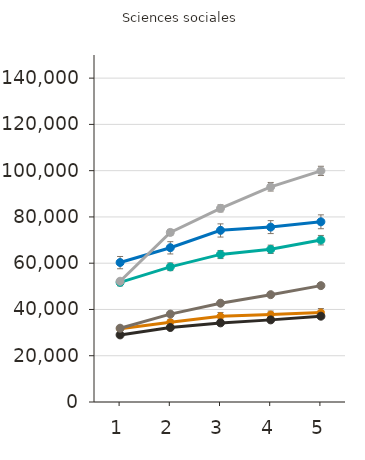
| Category | Certificat d'études collégial | Diplôme d'études collégial | Baccalauréat | Maîtrise | Doctorat | Grade professionnel |
|---|---|---|---|---|---|---|
| 1.0 | 31700 | 29000 | 31900 | 51700 | 60300 | 52200 |
| 2.0 | 34500 | 32200 | 38000 | 58400 | 66700 | 73300 |
| 3.0 | 37100 | 34200 | 42700 | 63800 | 74200 | 83700 |
| 4.0 | 37800 | 35500 | 46400 | 66000 | 75600 | 93000 |
| 5.0 | 38700 | 37100 | 50300 | 70000 | 77900 | 99900 |